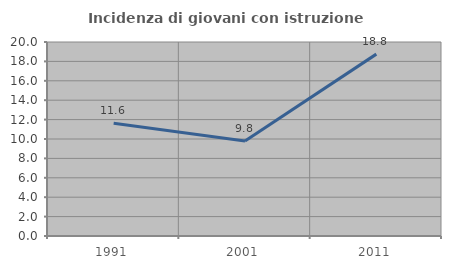
| Category | Incidenza di giovani con istruzione universitaria |
|---|---|
| 1991.0 | 11.628 |
| 2001.0 | 9.804 |
| 2011.0 | 18.75 |